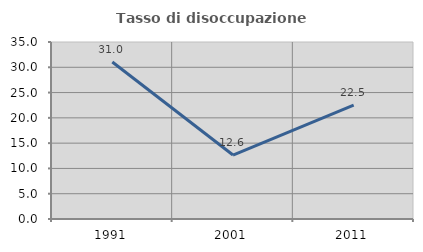
| Category | Tasso di disoccupazione giovanile  |
|---|---|
| 1991.0 | 31.034 |
| 2001.0 | 12.644 |
| 2011.0 | 22.5 |